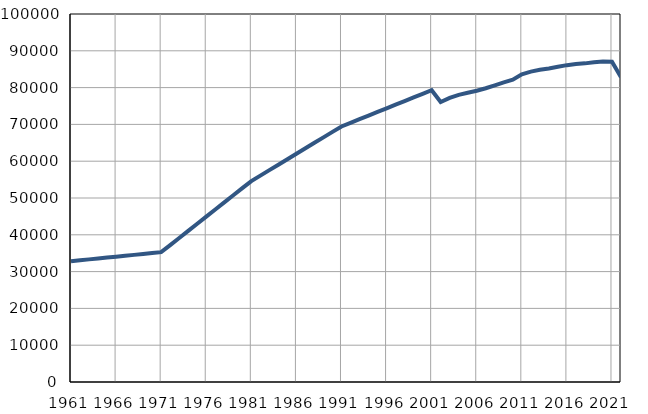
| Category | Population
size |
|---|---|
| 1961.0 | 32836 |
| 1962.0 | 33080 |
| 1963.0 | 33324 |
| 1964.0 | 33568 |
| 1965.0 | 33812 |
| 1966.0 | 34056 |
| 1967.0 | 34300 |
| 1968.0 | 34543 |
| 1969.0 | 34787 |
| 1970.0 | 35031 |
| 1971.0 | 35275 |
| 1972.0 | 37207 |
| 1973.0 | 39140 |
| 1974.0 | 41072 |
| 1975.0 | 43005 |
| 1976.0 | 44937 |
| 1977.0 | 46869 |
| 1978.0 | 48802 |
| 1979.0 | 50734 |
| 1980.0 | 52667 |
| 1981.0 | 54599 |
| 1982.0 | 56084 |
| 1983.0 | 57569 |
| 1984.0 | 59054 |
| 1985.0 | 60539 |
| 1986.0 | 62024 |
| 1987.0 | 63509 |
| 1988.0 | 64993 |
| 1989.0 | 66478 |
| 1990.0 | 67963 |
| 1991.0 | 69448 |
| 1992.0 | 70432 |
| 1993.0 | 71416 |
| 1994.0 | 72400 |
| 1995.0 | 73384 |
| 1996.0 | 74368 |
| 1997.0 | 75351 |
| 1998.0 | 76335 |
| 1999.0 | 77319 |
| 2000.0 | 78303 |
| 2001.0 | 79287 |
| 2002.0 | 76087 |
| 2003.0 | 77189 |
| 2004.0 | 78028 |
| 2005.0 | 78605 |
| 2006.0 | 79153 |
| 2007.0 | 79819 |
| 2008.0 | 80630 |
| 2009.0 | 81424 |
| 2010.0 | 82129 |
| 2011.0 | 83633 |
| 2012.0 | 84351 |
| 2013.0 | 84833 |
| 2014.0 | 85214 |
| 2015.0 | 85654 |
| 2016.0 | 86099 |
| 2017.0 | 86391 |
| 2018.0 | 86585 |
| 2019.0 | 86908 |
| 2020.0 | 87102 |
| 2021.0 | 87037 |
| 2022.0 | 82835 |